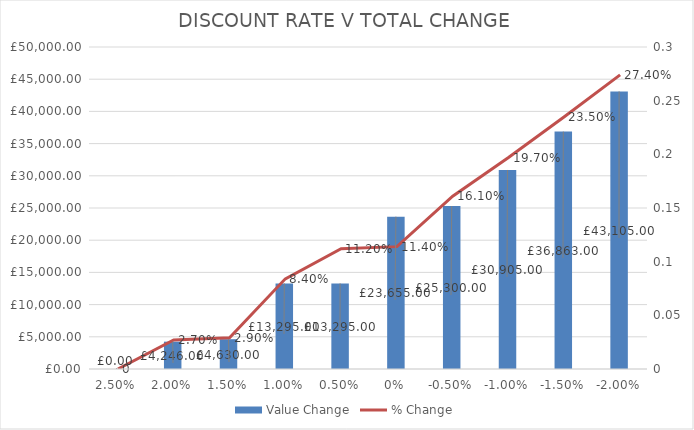
| Category | Value Change |
|---|---|
| 0.025 | 0 |
| 0.02 | 4246 |
| 0.015 | 4630 |
| 0.01 | 13295 |
| 0.005 | 13295 |
| 0.0 | 23655 |
| -0.005 | 25300 |
| -0.01 | 30905 |
| -0.015 | 36863 |
| -0.02 | 43105 |